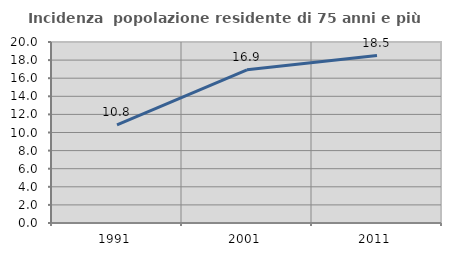
| Category | Incidenza  popolazione residente di 75 anni e più |
|---|---|
| 1991.0 | 10.847 |
| 2001.0 | 16.921 |
| 2011.0 | 18.498 |